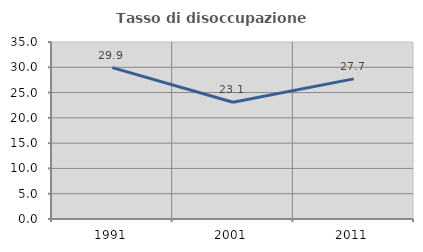
| Category | Tasso di disoccupazione giovanile  |
|---|---|
| 1991.0 | 29.932 |
| 2001.0 | 23.077 |
| 2011.0 | 27.711 |